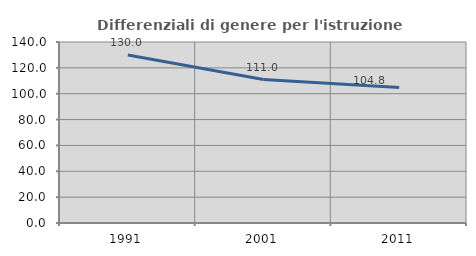
| Category | Differenziali di genere per l'istruzione superiore |
|---|---|
| 1991.0 | 130.014 |
| 2001.0 | 110.982 |
| 2011.0 | 104.797 |